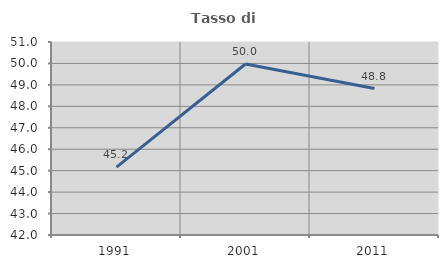
| Category | Tasso di occupazione   |
|---|---|
| 1991.0 | 45.165 |
| 2001.0 | 49.976 |
| 2011.0 | 48.827 |